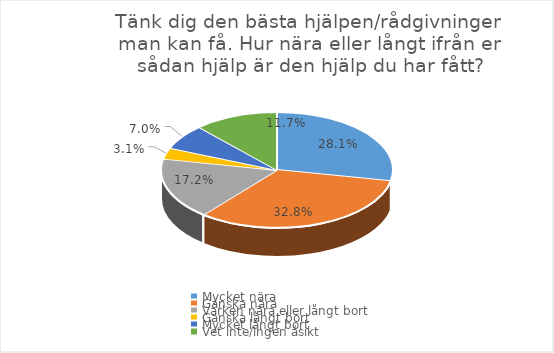
| Category | Series 0 |
|---|---|
| Mycket nära | 0.281 |
| Ganska nära | 0.328 |
| Varken nära eller långt bort | 0.172 |
| Ganska långt bort | 0.031 |
| Mycket långt bort | 0.07 |
| Vet inte/ingen åsikt | 0.117 |